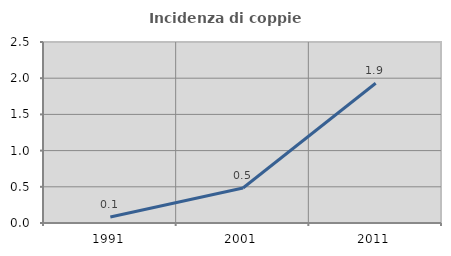
| Category | Incidenza di coppie miste |
|---|---|
| 1991.0 | 0.082 |
| 2001.0 | 0.483 |
| 2011.0 | 1.93 |